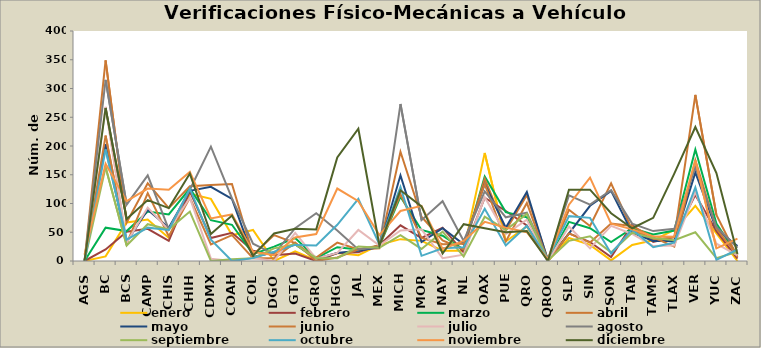
| Category | enero | febrero | marzo | abril | mayo | junio | julio | agosto | septiembre | octubre | noviembre | diciembre |
|---|---|---|---|---|---|---|---|---|---|---|---|---|
| AGS | 0 | 0 | 0 | 0 | 0 | 0 | 0 | 0 | 0 | 0 | 11 | 0 |
| BC | 8 | 20 | 58 | 349 | 203 | 218 | 268 | 315 | 163 | 194 | 169 | 266 |
| BCS | 67 | 51 | 52 | 67 | 33 | 30 | 32 | 98 | 27 | 37 | 104 | 73 |
| CAMP | 72 | 56 | 86 | 135 | 89 | 118 | 93 | 149 | 64 | 58 | 126 | 106 |
| CHIS | 40 | 35 | 81 | 92 | 58 | 43 | 54 | 55 | 55 | 54 | 124 | 92 |
| CHIH | 117 | 121 | 126 | 130 | 122 | 110 | 110 | 124 | 86 | 126 | 155 | 152 |
| CDMX | 108 | 40 | 71 | 132 | 129 | 29 | 4 | 199 | 0 | 37 | 74 | 47 |
| COAH | 45 | 49 | 63 | 134 | 108 | 45 | 0 | 109 | 3 | 0 | 81 | 79 |
| COL | 54 | 18 | 12 | 11 | 7 | 5 | 5 | 30 | 5 | 5 | 16 | 9 |
| DGO | 0 | 10 | 25 | 45 | 15 | 5 | 0 | 12 | 22 | 16 | 10 | 48 |
| GTO | 17 | 13 | 40 | 31 | 29 | 32 | 49 | 57 | 29 | 28 | 41 | 56 |
| GRO | 1 | 0 | 5 | 6 | 4 | 0 | 4 | 83 | 5 | 27 | 47 | 55 |
| HGO | 14 | 14 | 24 | 32 | 14 | 6 | 14 | 53 | 5 | 63 | 126 | 180 |
| JAL | 10 | 15 | 20 | 20 | 18 | 20 | 54 | 20 | 25 | 108 | 104 | 230 |
| MEX | 28 | 28 | 26 | 22 | 24 | 27 | 27 | 24 | 23 | 29 | 45 | 27 |
| MICH | 38 | 62 | 112 | 190 | 149 | 116 | 53 | 273 | 45 | 129 | 87 | 123 |
| MOR | 35 | 40 | 54 | 77 | 33 | 40 | 55 | 71 | 21 | 9 | 96 | 95 |
| NAY | 18 | 58 | 44 | 36 | 57 | 29 | 5 | 104 | 51 | 22 | 21 | 13 |
| NL | 18 | 15 | 20 | 20 | 29 | 30 | 11 | 35 | 8 | 24 | 35 | 64 |
| OAX | 188 | 110 | 147 | 143 | 134 | 134 | 111 | 121 | 77 | 91 | 68 | 57 |
| PUE | 34 | 87 | 85 | 53 | 58 | 34 | 47 | 76 | 54 | 27 | 58 | 50 |
| QRO | 60 | 62 | 76 | 115 | 120 | 101 | 72 | 84 | 82 | 61 | 50 | 52 |
| QROO | 0 | 0 | 0 | 2 | 1 | 0 | 0 | 3 | 1 | 3 | 3 | 0 |
| SLP | 40 | 48 | 68 | 89 | 48 | 48 | 60 | 114 | 35 | 78 | 98 | 124 |
| SIN | 28 | 33 | 57 | 61 | 96 | 32 | 22 | 98 | 43 | 75 | 145 | 124 |
| SON | 1 | 7 | 33 | 135 | 122 | 65 | 61 | 123 | 15 | 13 | 65 | 83 |
| TAB | 28 | 63 | 57 | 54 | 49 | 61 | 47 | 65 | 49 | 55 | 55 | 57 |
| TAMS | 36 | 33 | 46 | 38 | 35 | 41 | 26 | 52 | 40 | 24 | 43 | 75 |
| TLAX | 54 | 42 | 53 | 41 | 35 | 25 | 27 | 56 | 36 | 32 | 42 | 152 |
| VER | 96 | 115 | 194 | 289 | 154 | 175 | 120 | 163 | 50 | 128 | 175 | 233 |
| YUC | 48 | 52 | 65 | 80 | 55 | 56 | 30 | 59 | 5 | 2 | 22 | 153 |
| ZAC | 0 | 4 | 10 | 7 | 26 | 10 | 10 | 23 | 16 | 20 | 39 | 12 |